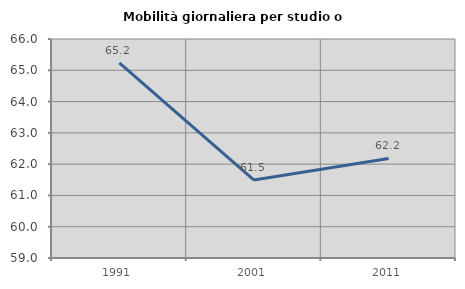
| Category | Mobilità giornaliera per studio o lavoro |
|---|---|
| 1991.0 | 65.241 |
| 2001.0 | 61.492 |
| 2011.0 | 62.183 |